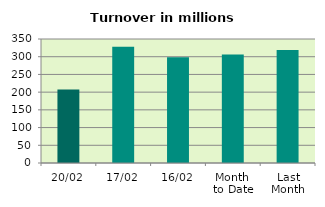
| Category | Series 0 |
|---|---|
| 20/02 | 207.231 |
| 17/02 | 328.149 |
| 16/02 | 298.158 |
| Month 
to Date | 306.071 |
| Last
Month | 318.977 |